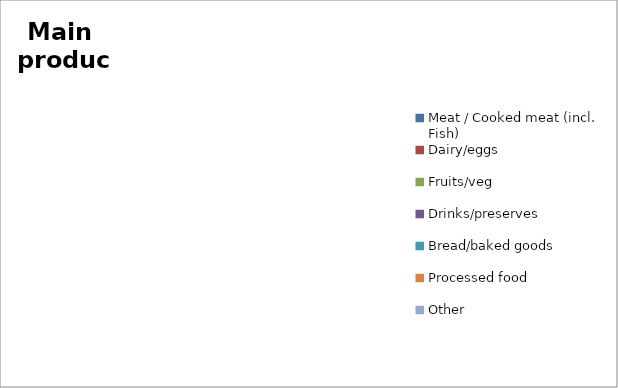
| Category | Series 0 |
|---|---|
| Meat / Cooked meat (incl. Fish) | 0 |
| Dairy/eggs | 0 |
| Fruits/veg | 0 |
| Drinks/preserves | 0 |
| Bread/baked goods | 0 |
| Processed food | 0 |
| Other | 0 |